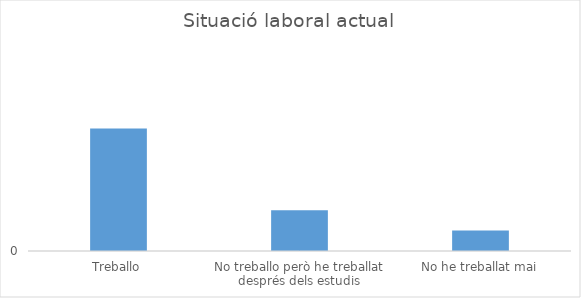
| Category | Series 0 |
|---|---|
| Treballo | 6 |
| No treballo però he treballat després dels estudis | 2 |
| No he treballat mai | 1 |